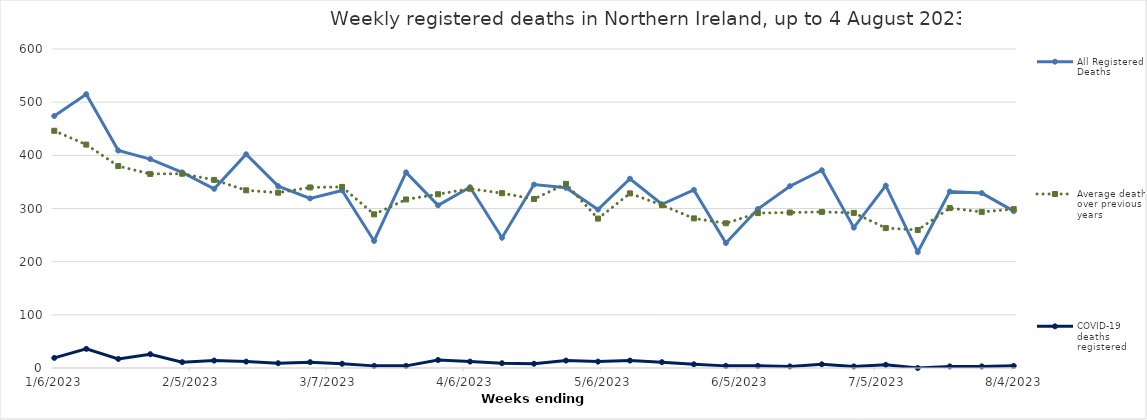
| Category | All Registered Deaths | Average deaths over previous 5 years | COVID-19 deaths registered |
|---|---|---|---|
| 1/10/20 | 395 | 402 | 0 |
| 1/17/20 | 411 | 391 | 0 |
| 1/24/20 | 347 | 382.6 | 0 |
| 1/31/20 | 323 | 373.6 | 0 |
| 2/7/20 | 332 | 345.8 | 0 |
| 2/14/20 | 306 | 339.8 | 0 |
| 2/21/20 | 297 | 317 | 0 |
| 2/28/20 | 347 | 343 | 0 |
| 3/6/20 | 312 | 356 | 0 |
| 3/13/20 | 324 | 342.8 | 0 |
| 3/20/20 | 271 | 297.2 | 1 |
| 3/27/20 | 287 | 319.6 | 9 |
| 4/3/20 | 434 | 298 | 55 |
| 4/10/20 | 435 | 294.6 | 76 |
| 4/17/20 | 424 | 290.4 | 101 |
| 4/24/20 | 470 | 283.8 | 128 |
| 5/1/20 | 427 | 319.6 | 124 |
| 5/8/20 | 336 | 273.8 | 84 |
| 5/15/20 | 396 | 294.8 | 74 |
| 5/22/20 | 325 | 289.8 | 53 |
| 5/29/20 | 316 | 279 | 49 |
| 6/5/20 | 304 | 270.6 | 20 |
| 6/12/20 | 292 | 293.2 | 21 |
| 6/19/20 | 290 | 286.4 | 17 |
| 6/26/20 | 295 | 270 | 12 |
| 7/3/20 | 289 | 288.2 | 11 |
| 7/10/20 | 275 | 255.2 | 9 |
| 7/17/20 | 240 | 264 | 2 |
| 7/24/20 | 307 | 264.6 | 7 |
| 7/31/20 | 273 | 282 | 1 |
| 8/7/20 | 280 | 276 | 5 |
| 8/14/20 | 278 | 265 | 4 |
| 8/21/20 | 313 | 263 | 6 |
| 8/28/20 | 303 | 259 | 4 |
| 9/4/20 | 234 | 255 | 3 |
| 9/11/20 | 296 | 276 | 7 |
| 9/18/20 | 322 | 282 | 8 |
| 9/25/20 | 323 | 288 | 9 |
| 10/2/20 | 328 | 286 | 2 |
| 10/9/20 | 348 | 300.4 | 11 |
| 10/16/20 | 278 | 294.8 | 17 |
| 10/23/20 | 391 | 285.6 | 42 |
| 10/30/20 | 368 | 283.6 | 51 |
| 11/6/20 | 386 | 296 | 82 |
| 11/13/20 | 406 | 297 | 96 |
| 11/20/20 | 396 | 319 | 100 |
| 11/27/20 | 348 | 311.4 | 81 |
| 12/4/20 | 387 | 322.4 | 98 |
| 12/11/20 | 366 | 321.8 | 87 |
| 12/18/20 | 350 | 343.8 | 82 |
| 12/25/20 | 310 | 280.8 | 88 |
| 1/1/21 | 333 | 279.6 | 94 |
| 1/8/21 | 568 | 417 | 145 |
| 1/15/21 | 443 | 399 | 153 |
| 1/22/21 | 474 | 375 | 182 |
| 1/29/21 | 437 | 359 | 137 |
| 2/5/21 | 462 | 337 | 126 |
| 2/12/21 | 382 | 331.6 | 99 |
| 2/19/21 | 352 | 310.8 | 78 |
| 2/26/21 | 351 | 349 | 55 |
| 3/5/21 | 319 | 338 | 33 |
| 3/12/21 | 339 | 338 | 32 |
| 3/19/21 | 253 | 286.8 | 15 |
| 3/26/21 | 307 | 315 | 19 |
| 4/2/21 | 288 | 320.2 | 12 |
| 4/9/21 | 245 | 337.4 | 9 |
| 4/16/21 | 289 | 316.4 | 16 |
| 4/23/21 | 305 | 312.4 | 7 |
| 4/30/21 | 291 | 341.8 | 8 |
| 5/7/21 | 270 | 274 | 3 |
| 5/14/21 | 329 | 323 | 7 |
| 5/21/21 | 319 | 295 | 4 |
| 5/28/21 | 265 | 284 | 3 |
| 6/4/21 | 282 | 280 | 2 |
| 6/11/21 | 265 | 284 | 2 |
| 6/18/21 | 313 | 290 | 1 |
| 6/25/21 | 319 | 271 | 2 |
| 7/2/21 | 272 | 285 | 1 |
| 7/9/21 | 298 | 250 | 3 |
| 7/16/21 | 231 | 262 | 3 |
| 7/23/21 | 306 | 285 | 9 |
| 7/30/21 | 293 | 282 | 18 |
| 8/6/21 | 342 | 273 | 31 |
| 8/13/21 | 331 | 271 | 40 |
| 8/20/21 | 343 | 279 | 43 |
| 8/27/21 | 299 | 270 | 53 |
| 9/3/21 | 340 | 250 | 64 |
| 9/10/21 | 377 | 288 | 61 |
| 9/17/21 | 374 | 282 | 63 |
| 9/24/21 | 351 | 296 | 55 |
| 10/1/21 | 380 | 294 | 48 |
| 10/8/21 | 330 | 313.6 | 28 |
| 10/15/21 | 337 | 289.6 | 38 |
| 10/22/21 | 313 | 304 | 52 |
| 10/29/21 | 320 | 302 | 50 |
| 11/5/21 | 371 | 315 | 59 |
| 11/12/21 | 403 | 320.4 | 62 |
| 11/19/21 | 375 | 339 | 42 |
| 11/26/21 | 413 | 322.2 | 65 |
| 12/3/21 | 378 | 344 | 29 |
| 12/10/21 | 368 | 336.2 | 39 |
| 12/17/21 | 363 | 345.2 | 32 |
| 12/24/21 | 347 | 282.6 | 30 |
| 12/31/21 | 243 | 299.8 | 14 |
| 1/7/22 | 416 | 446.2 | 29 |
| 1/14/22 | 445 | 418 | 43 |
| 1/21/22 | 317 | 395.8 | 43 |
| 1/28/22 | 336 | 375.2 | 38 |
| 2/4/22 | 363 | 367 | 30 |
| 2/11/22 | 375 | 346 | 40 |
| 2/18/22 | 319 | 338 | 31 |
| 2/25/22 | 327 | 334.6 | 33 |
| 3/4/22 | 338 | 342.4 | 34 |
| 3/11/22 | 338 | 344.4 | 32 |
| 3/18/22 | 301 | 279 | 25 |
| 3/25/22 | 365 | 315.2 | 33 |
| 4/1/22 | 339 | 321.8 | 38 |
| 4/8/22 | 355 | 327.4 | 32 |
| 4/15/22 | 335 | 315.8 | 20 |
| 4/22/22 | 260 | 314.8 | 22 |
| 4/29/22 | 365 | 338.8 | 28 |
| 5/6/22 | 281 | 276.4 | 16 |
| 5/13/22 | 322 | 324.4 | 16 |
| 5/20/22 | 312 | 307 | 15 |
| 5/27/22 | 329 | 281.2 | 13 |
| 6/3/22 | 220 | 279.4 | 5 |
| 6/10/22 | 342 | 281.6 | 12 |
| 6/17/22 | 298 | 292.8 | 4 |
| 6/24/22 | 322 | 284 | 10 |
| 7/1/22 | 347 | 281.6 | 19 |
| 7/8/22 | 315 | 252.6 | 24 |
| 7/15/22 | 249 | 260.4 | 27 |
| 7/22/22 | 340 | 290.4 | 27 |
| 7/29/22 | 351 | 280.8 | 22 |
| 8/5/22 | 336 | 289 | 19 |
| 8/12/22 | 301 | 282.8 | 16 |
| 8/19/22 | 320 | 295.2 | 13 |
| 8/26/22 | 315 | 269.4 | 11 |
| 9/2/22 | 263 | 265 | 6 |
| 9/9/22 | 314 | 308 | 9 |
| 9/16/22 | 333 | 298 | 6 |
| 9/23/22 | 276 | 312 | 6 |
| 9/30/22 | 299 | 315 | 11 |
| 10/7/22 | 311 | 318 | 13 |
| 10/14/22 | 308 | 299 | 8 |
| 10/21/22 | 331 | 307 | 8 |
| 10/28/22 | 339 | 312 | 19 |
| 11/4/22 | 373 | 333.2 | 12 |
| 11/11/22 | 368 | 343 | 18 |
| 11/18/22 | 386 | 345.8 | 8 |
| 11/25/22 | 360 | 339 | 12 |
| 12/2/22 | 338 | 359 | 14 |
| 12/9/22 | 360 | 345.4 | 14 |
| 12/16/22 | 360 | 353 | 7 |
| 12/23/22 | 411 | 280 | 21 |
| 12/30/22 | 238 | 308.6 | 9 |
| 1/6/23 | 474 | 446.2 | 19 |
| 1/13/23 | 515 | 420.2 | 36 |
| 1/20/23 | 409 | 379.8 | 17 |
| 1/27/23 | 393 | 365 | 26 |
| 2/3/23 | 368 | 365.4 | 11 |
| 2/10/23 | 337 | 353.8 | 14 |
| 2/17/23 | 402 | 334.2 | 12 |
| 2/24/23 | 342 | 329.8 | 9 |
| 3/3/23 | 319 | 339.6 | 11 |
| 3/10/23 | 334 | 340.6 | 8 |
| 3/17/23 | 239 | 289 | 4 |
| 3/24/23 | 368 | 317 | 4 |
| 3/31/23 | 306 | 326.8 | 15 |
| 4/7/23 | 340 | 337.2 | 12 |
| 4/14/23 | 245 | 328.8 | 9 |
| 4/21/23 | 345 | 317.8 | 8 |
| 4/28/23 | 339 | 346.4 | 14 |
| 5/5/23 | 298 | 281 | 12 |
| 5/12/23 | 356 | 328.4 | 14 |
| 5/19/23 | 308 | 306.4 | 11 |
| 5/26/23 | 335 | 281.4 | 7 |
| 6/2/23 | 235 | 272.2 | 4 |
| 6/9/23 | 299 | 291.4 | 4 |
| 6/16/23 | 342 | 292.4 | 3 |
| 6/23/23 | 372 | 293.6 | 7 |
| 6/30/23 | 264 | 291.8 | 3 |
| 7/7/23 | 343 | 263.2 | 6 |
| 7/14/23 | 218 | 259.6 | 0 |
| 7/21/23 | 332 | 300.8 | 3 |
| 7/28/23 | 329 | 293.6 | 3 |
| 8/4/23 | 295 | 298.8 | 4 |